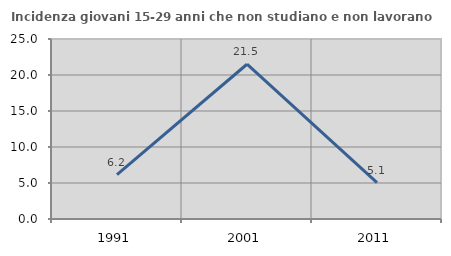
| Category | Incidenza giovani 15-29 anni che non studiano e non lavorano  |
|---|---|
| 1991.0 | 6.173 |
| 2001.0 | 21.495 |
| 2011.0 | 5.063 |